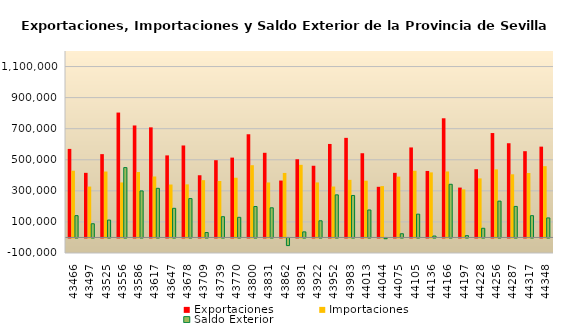
| Category | Exportaciones | Importaciones | Saldo Exterior |
|---|---|---|---|
| 2019-01-01 | 569931.277 | 429494.742 | 140436.534 |
| 2019-02-01 | 415835.783 | 327549.688 | 88286.094 |
| 2019-03-01 | 536289.213 | 424398.806 | 111890.407 |
| 2019-04-01 | 803799.832 | 354056.045 | 449743.787 |
| 2019-05-01 | 720786.65 | 421173.779 | 299612.871 |
| 2019-06-01 | 708636.402 | 392376.669 | 316259.734 |
| 2019-07-01 | 528188.273 | 340690.207 | 187498.067 |
| 2019-08-01 | 592019.511 | 341747.051 | 250272.46 |
| 2019-09-01 | 400434 | 368760 | 31674 |
| 2019-10-01 | 497188.203 | 363534.861 | 133653.342 |
| 2019-11-01 | 513902.151 | 384307.903 | 129594.248 |
| 2019-12-01 | 664224.395 | 464969.096 | 199255.3 |
| 2020-01-01 | 544870.53 | 354001.597 | 190868.934 |
| 2020-02-01 | 366257.686 | 415208.864 | -48951.178 |
| 2020-03-01 | 503457.961 | 467455.717 | 36002.244 |
| 2020-04-01 | 461491.765 | 354222.346 | 107269.419 |
| 2020-05-01 | 601776.553 | 327669.596 | 274106.957 |
| 2020-06-01 | 641019.697 | 370799.774 | 270219.922 |
| 2020-07-01 | 542062.842 | 365220.14 | 176842.702 |
| 2020-08-01 | 326019.875 | 330571.151 | -4551.276 |
| 2020-09-01 | 415851.902 | 391765.108 | 24086.795 |
| 2020-10-01 | 579330.618 | 429257.837 | 150072.781 |
| 2020-11-01 | 428116.983 | 418885.529 | 9231.454 |
| 2020-12-01 | 766984.753 | 424753.82 | 342230.933 |
| 2021-01-01 | 321034.509 | 309401.545 | 11632.963 |
| 2021-02-01 | 439118.252 | 380078.53 | 59039.722 |
| 2021-03-01 | 672033.912 | 438109.505 | 233924.407 |
| 2021-04-01 | 606425.006 | 406580.734 | 199844.272 |
| 2021-05-01 | 555191.585 | 414958.964 | 140232.621 |
| 2021-06-01 | 584517.857 | 458749.69 | 125768.167 |